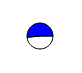
| Category | Series 0 |
|---|---|
| 0 | 22434 |
| 1 | 23898 |